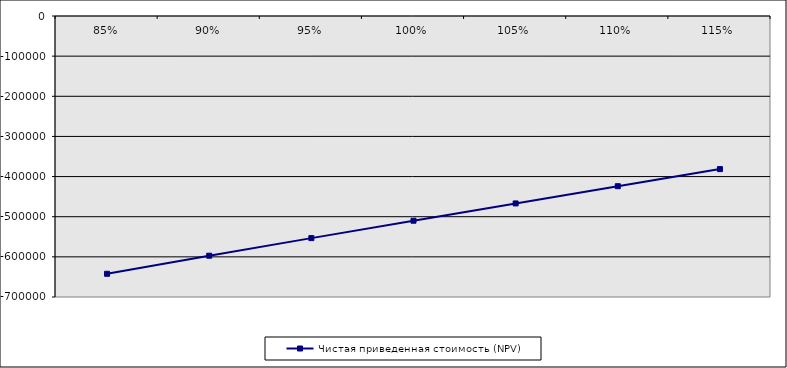
| Category | Чистая приведенная стоимость (NPV) |
|---|---|
| 0.85 | -642175.356 |
| 0.9 | -597153.551 |
| 0.9500000000000001 | -553313.086 |
| 1.0 | -509953.077 |
| 1.05 | -466907.388 |
| 1.1 | -423983.017 |
| 1.1500000000000001 | -381404.292 |